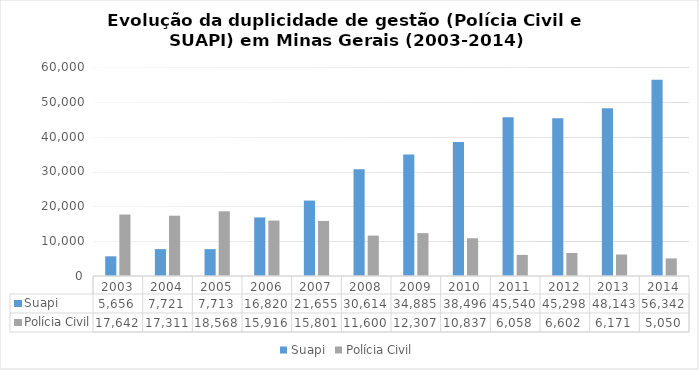
| Category | Suapi | Polícia Civil |
|---|---|---|
| 0 | 5656 | 17642 |
| 1 | 7721 | 17311 |
| 2 | 7713 | 18568 |
| 3 | 16820 | 15916 |
| 4 | 21655 | 15801 |
| 5 | 30614 | 11600 |
| 6 | 34885 | 12307 |
| 7 | 38496 | 10837 |
| 8 | 45540 | 6058 |
| 9 | 45298 | 6602 |
| 10 | 48143 | 6171 |
| 11 | 56342 | 5050 |